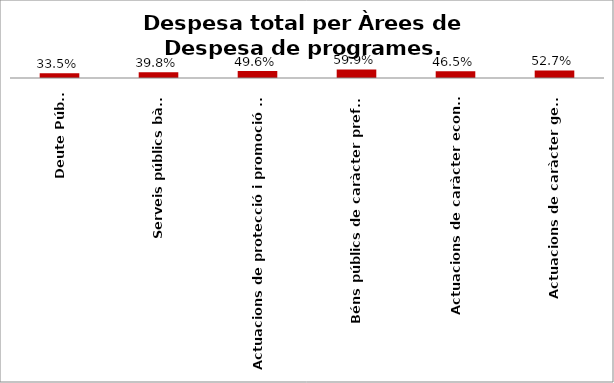
| Category | Series 0 |
|---|---|
| Deute Públic | 0.335 |
| Serveis públics bàsics | 0.398 |
| Actuacions de protecció i promoció social | 0.496 |
| Béns públics de caràcter preferent | 0.599 |
| Actuacions de caràcter econòmic | 0.465 |
| Actuacions de caràcter general | 0.527 |